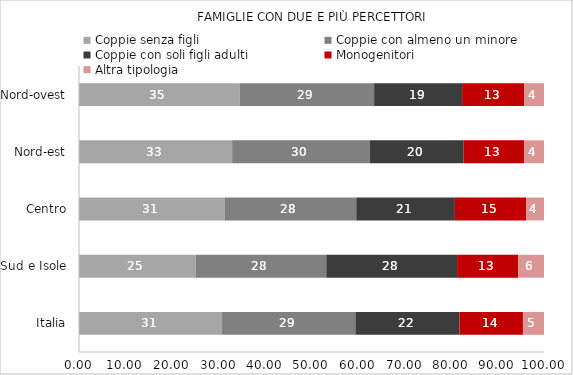
| Category | Coppie senza figli | Coppie con almeno un minore | Coppie con soli figli adulti | Monogenitori | Altra tipologia |
|---|---|---|---|---|---|
| Italia | 30.76 | 28.68 | 22.38 | 13.65 | 4.53 |
| Sud e Isole | 25.13 | 28.05 | 28.13 | 13.16 | 5.53 |
| Centro | 31.32 | 28.31 | 21.21 | 15.36 | 3.81 |
| Nord-est | 32.93 | 29.56 | 20.24 | 12.99 | 4.29 |
| Nord-ovest | 34.52 | 28.95 | 18.92 | 13.4 | 4.21 |